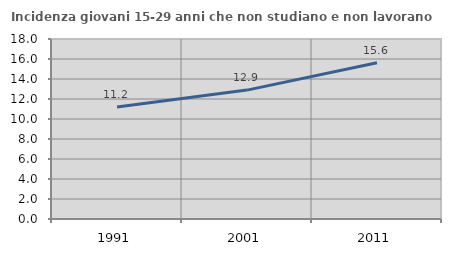
| Category | Incidenza giovani 15-29 anni che non studiano e non lavorano  |
|---|---|
| 1991.0 | 11.193 |
| 2001.0 | 12.889 |
| 2011.0 | 15.616 |